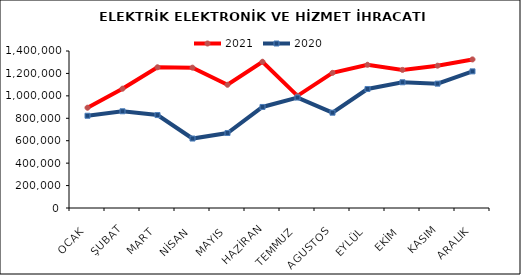
| Category | 2021 | 2020 |
|---|---|---|
| OCAK | 894349.384 | 822563.702 |
| ŞUBAT | 1064013.135 | 862522.969 |
| MART | 1254817.575 | 828820.906 |
| NİSAN | 1251409.44 | 619436.812 |
| MAYIS | 1098961.597 | 668904.088 |
| HAZİRAN | 1304195.406 | 901025.821 |
| TEMMUZ | 1000400.652 | 984826.734 |
| AGUSTOS | 1205168.814 | 849842.016 |
| EYLÜL | 1277122.494 | 1061217.331 |
| EKİM | 1231479.868 | 1121149.406 |
| KASIM | 1269105.423 | 1108998.922 |
| ARALIK | 1324998.332 | 1218440.189 |